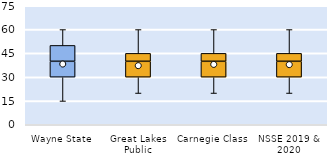
| Category | 25th | 50th | 75th |
|---|---|---|---|
| Wayne State | 30 | 10 | 10 |
| Great Lakes Public | 30 | 10 | 5 |
| Carnegie Class | 30 | 10 | 5 |
| NSSE 2019 & 2020 | 30 | 10 | 5 |